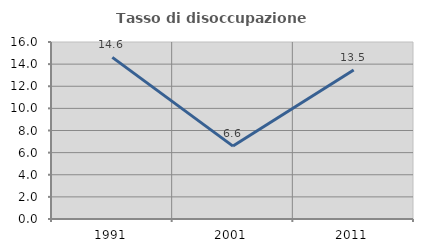
| Category | Tasso di disoccupazione giovanile  |
|---|---|
| 1991.0 | 14.611 |
| 2001.0 | 6.59 |
| 2011.0 | 13.468 |